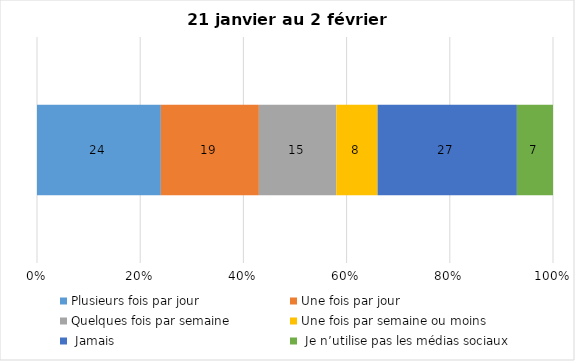
| Category | Plusieurs fois par jour | Une fois par jour | Quelques fois par semaine   | Une fois par semaine ou moins   |  Jamais   |  Je n’utilise pas les médias sociaux |
|---|---|---|---|---|---|---|
| 0 | 24 | 19 | 15 | 8 | 27 | 7 |